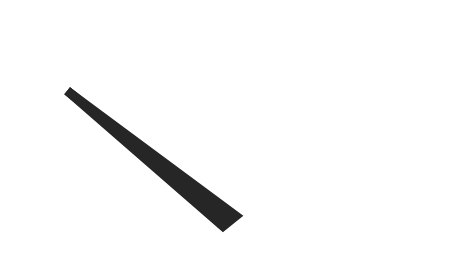
| Category | Series 0 |
|---|---|
| 14.644660940672622 | 35.355 |
| 51.41421356237309 | 1.414 |
| 48.58578643762691 | -1.414 |
| 14.644660940672622 | 35.355 |
| 50.0 | 0 |